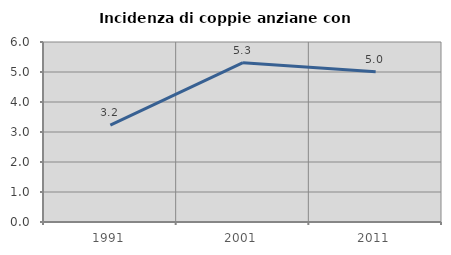
| Category | Incidenza di coppie anziane con figli |
|---|---|
| 1991.0 | 3.226 |
| 2001.0 | 5.311 |
| 2011.0 | 5.005 |